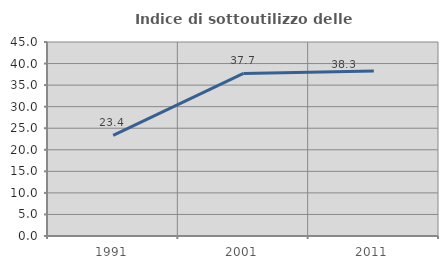
| Category | Indice di sottoutilizzo delle abitazioni  |
|---|---|
| 1991.0 | 23.364 |
| 2001.0 | 37.719 |
| 2011.0 | 38.261 |